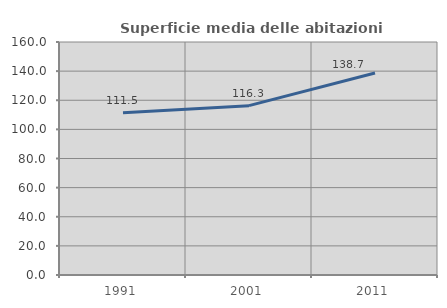
| Category | Superficie media delle abitazioni occupate |
|---|---|
| 1991.0 | 111.472 |
| 2001.0 | 116.292 |
| 2011.0 | 138.744 |